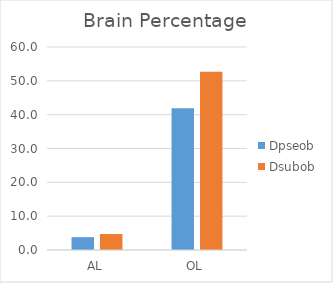
| Category | Dpseob | Dsubob |
|---|---|---|
| AL | 3.794 | 4.72 |
| OL | 41.891 | 52.674 |